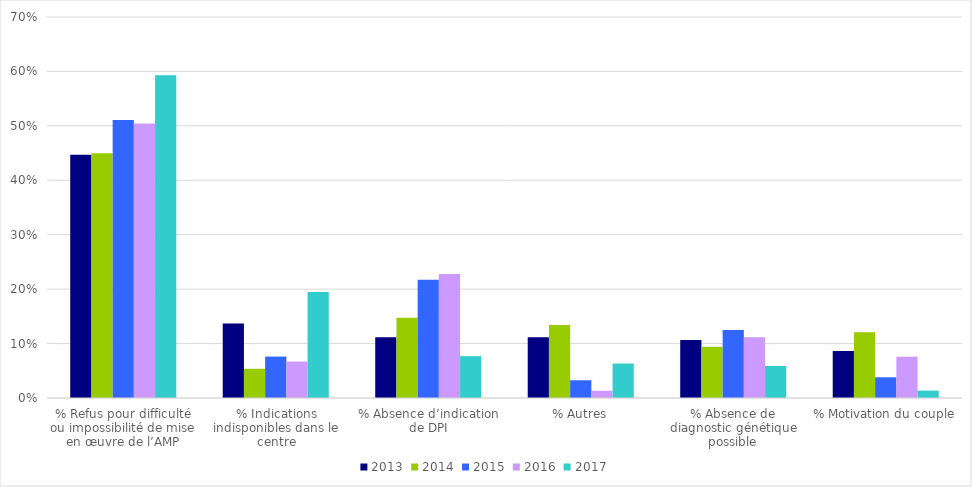
| Category | 2013 | 2014 | 2015 | 2016 | 2017 |
|---|---|---|---|---|---|
| % Refus pour difficulté ou impossibilité de mise en œuvre de l’AMP | 0.447 | 0.45 | 0.511 | 0.504 | 0.593 |
| % Indications indisponibles dans le centre | 0.137 | 0.054 | 0.076 | 0.067 | 0.195 |
| % Absence d’indication de DPI | 0.112 | 0.148 | 0.217 | 0.228 | 0.077 |
| % Autres | 0.112 | 0.134 | 0.033 | 0.013 | 0.063 |
| % Absence de diagnostic génétique possible | 0.107 | 0.094 | 0.125 | 0.112 | 0.059 |
| % Motivation du couple | 0.086 | 0.121 | 0.038 | 0.076 | 0.014 |